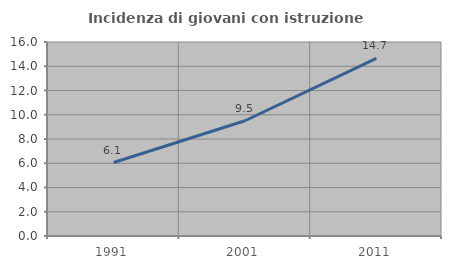
| Category | Incidenza di giovani con istruzione universitaria |
|---|---|
| 1991.0 | 6.061 |
| 2001.0 | 9.506 |
| 2011.0 | 14.652 |